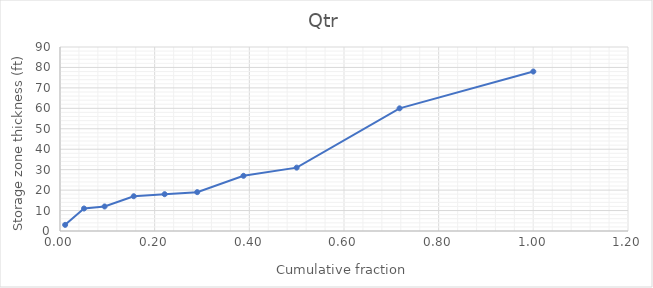
| Category | Series 0 |
|---|---|
| 0.010869565217391304 | 3 |
| 0.05072463768115942 | 11 |
| 0.09420289855072464 | 12 |
| 0.15579710144927536 | 17 |
| 0.22101449275362317 | 18 |
| 0.28985507246376807 | 19 |
| 0.3876811594202898 | 27 |
| 0.49999999999999994 | 31 |
| 0.717391304347826 | 60 |
| 1.0 | 78 |